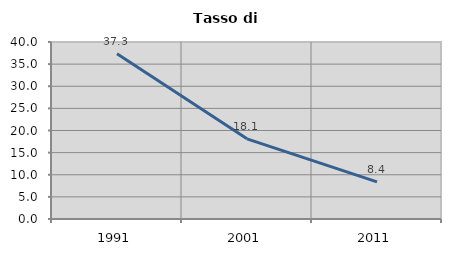
| Category | Tasso di disoccupazione   |
|---|---|
| 1991.0 | 37.329 |
| 2001.0 | 18.12 |
| 2011.0 | 8.398 |